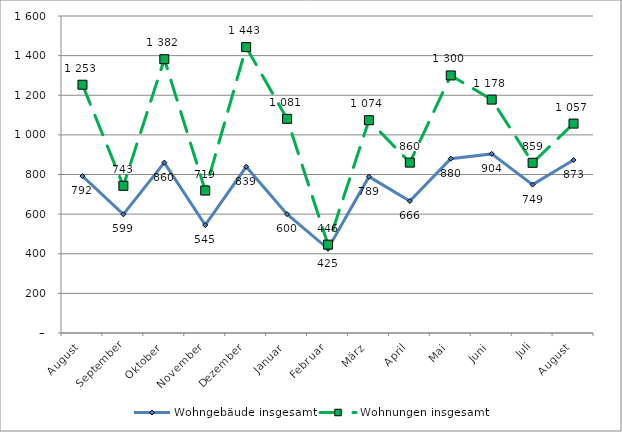
| Category | Wohngebäude insgesamt | Wohnungen insgesamt |
|---|---|---|
| August | 792 | 1253 |
| September | 599 | 743 |
| Oktober | 860 | 1382 |
| November | 545 | 719 |
| Dezember | 839 | 1443 |
| Januar | 600 | 1081 |
| Februar | 425 | 446 |
| März | 789 | 1074 |
| April | 666 | 860 |
| Mai | 880 | 1300 |
| Juni | 904 | 1178 |
| Juli | 749 | 859 |
| August | 873 | 1057 |